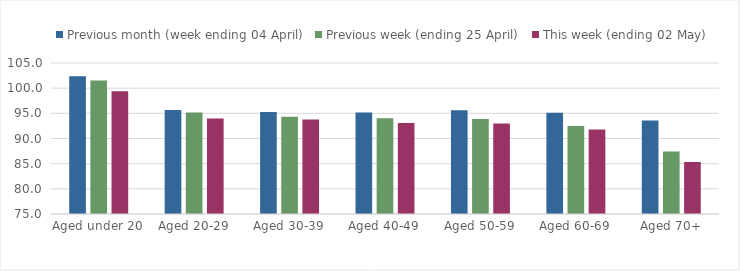
| Category | Previous month (week ending 04 April) | Previous week (ending 25 April) | This week (ending 02 May) |
|---|---|---|---|
| Aged under 20 | 102.374 | 101.539 | 99.398 |
| Aged 20-29 | 95.659 | 95.164 | 93.987 |
| Aged 30-39 | 95.272 | 94.342 | 93.772 |
| Aged 40-49 | 95.184 | 93.999 | 93.094 |
| Aged 50-59 | 95.596 | 93.858 | 92.968 |
| Aged 60-69 | 95.106 | 92.49 | 91.797 |
| Aged 70+ | 93.598 | 87.426 | 85.329 |